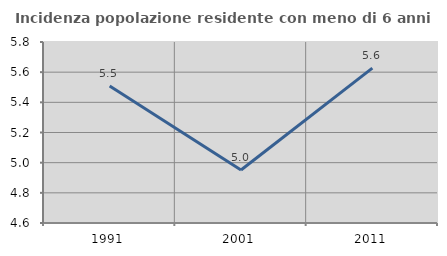
| Category | Incidenza popolazione residente con meno di 6 anni |
|---|---|
| 1991.0 | 5.508 |
| 2001.0 | 4.952 |
| 2011.0 | 5.627 |